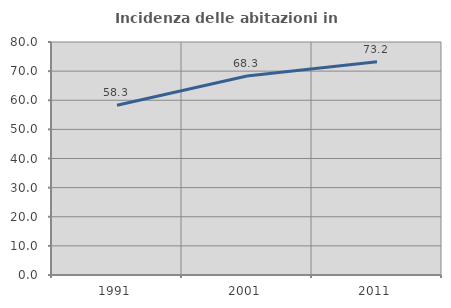
| Category | Incidenza delle abitazioni in proprietà  |
|---|---|
| 1991.0 | 58.277 |
| 2001.0 | 68.332 |
| 2011.0 | 73.228 |